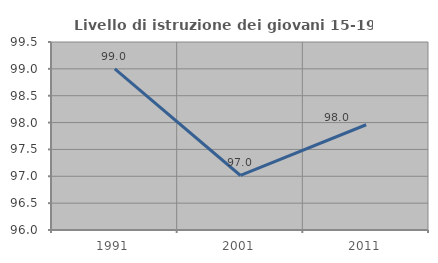
| Category | Livello di istruzione dei giovani 15-19 anni |
|---|---|
| 1991.0 | 99 |
| 2001.0 | 97.015 |
| 2011.0 | 97.959 |